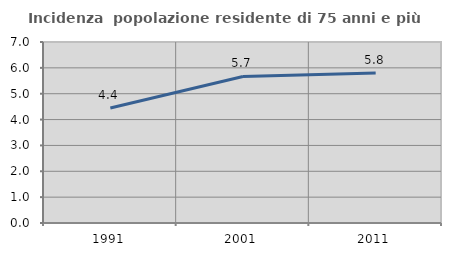
| Category | Incidenza  popolazione residente di 75 anni e più |
|---|---|
| 1991.0 | 4.445 |
| 2001.0 | 5.668 |
| 2011.0 | 5.803 |